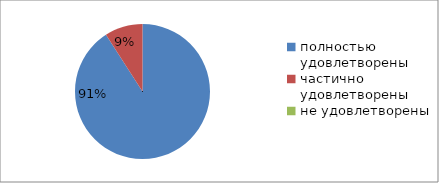
| Category | Series 0 |
|---|---|
| полностью удовлетворены | 90.9 |
| частично удовлетворены | 9.1 |
| не удовлетворены | 0 |